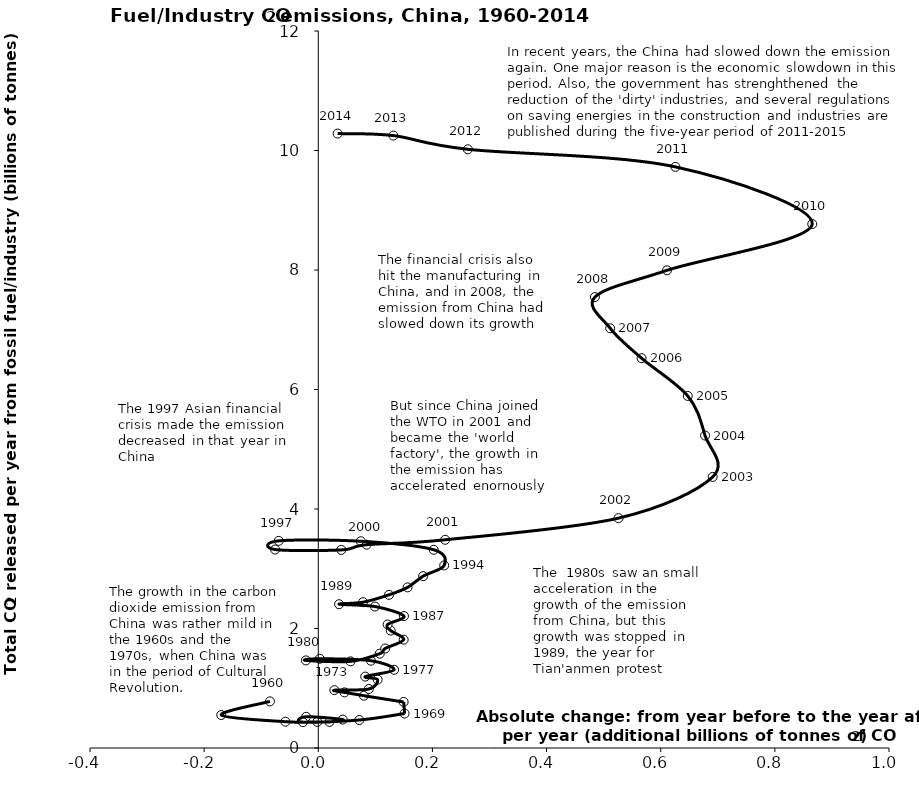
| Category | Series 0 |
|---|---|
| -0.084772136 | 0.78 |
| -0.17004440800000004 | 0.552 |
| -0.05763838399999999 | 0.44 |
| -0.0017165839999999932 | 0.436 |
| 0.019622552000000015 | 0.437 |
| 0.04289811199999996 | 0.476 |
| -0.021351960000000003 | 0.522 |
| -0.02690841599999999 | 0.433 |
| 0.07194264 | 0.469 |
| 0.15122060800000003 | 0.577 |
| 0.149575472 | 0.771 |
| 0.07991367200000005 | 0.876 |
| 0.04591724800000008 | 0.931 |
| 0.028196311999999946 | 0.968 |
| 0.08845995200000001 | 0.987 |
| 0.10400447200000001 | 1.145 |
| 0.08228427999999999 | 1.195 |
| 0.13287862400000006 | 1.309 |
| 0.092199064 | 1.461 |
| 0.0025098399999998744 | 1.494 |
| -0.021661567999999964 | 1.466 |
| 0.05648788800000004 | 1.45 |
| 0.10767579999999988 | 1.579 |
| 0.11722784799999997 | 1.666 |
| 0.149639592 | 1.813 |
| 0.12692645599999997 | 1.965 |
| 0.12147808800000026 | 2.067 |
| 0.15014339200000015 | 2.208 |
| 0.09933470399999988 | 2.368 |
| 0.03643481599999987 | 2.407 |
| 0.07846272800000009 | 2.44 |
| 0.12391098400000011 | 2.563 |
| 0.1564216559999998 | 2.688 |
| 0.18374227199999993 | 2.876 |
| 0.22061493600000004 | 3.056 |
| 0.20225829600000012 | 3.318 |
| 0.07455140800000004 | 3.46 |
| -0.06931555200000017 | 3.467 |
| -0.07566526399999995 | 3.322 |
| 0.0403846080000001 | 3.315 |
| 0.08468603200000002 | 3.402 |
| 0.22236266400000027 | 3.485 |
| 0.5259946800000002 | 3.847 |
| 0.6910688719999998 | 4.537 |
| 0.6777154239999996 | 5.229 |
| 0.6473463599999998 | 5.892 |
| 0.5664562320000002 | 6.524 |
| 0.511470584 | 7.025 |
| 0.48470872799999976 | 7.547 |
| 0.6109848239999995 | 7.994 |
| 0.8655558800000005 | 8.769 |
| 0.6257544080000006 | 9.726 |
| 0.2620199679999997 | 10.02 |
| 0.13156874399999996 | 10.25 |
| 0.03389199999999981 | 10.284 |